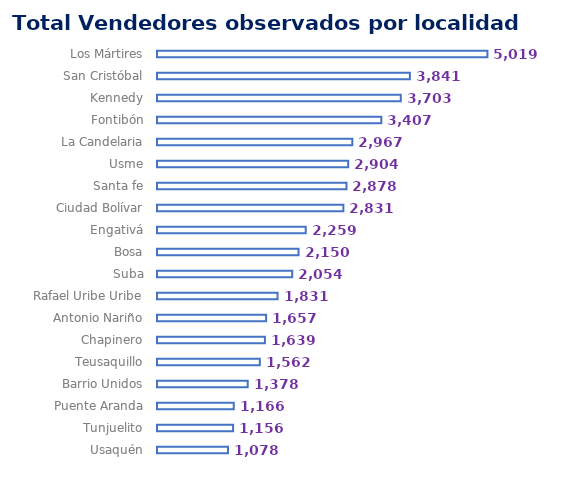
| Category | T Vendedores |
|---|---|
| Los Mártires | 5019 |
| San Cristóbal | 3841 |
| Kennedy | 3703 |
| Fontibón | 3407 |
| La Candelaria | 2967 |
| Usme | 2904 |
| Santa fe | 2878 |
| Ciudad Bolívar | 2831 |
| Engativá | 2259 |
| Bosa | 2150 |
| Suba | 2054 |
| Rafael Uribe Uribe | 1831 |
| Antonio Nariño | 1657 |
| Chapinero | 1639 |
| Teusaquillo | 1562 |
| Barrio Unidos | 1378 |
| Puente Aranda | 1166 |
| Tunjuelito | 1156 |
| Usaquén | 1078 |